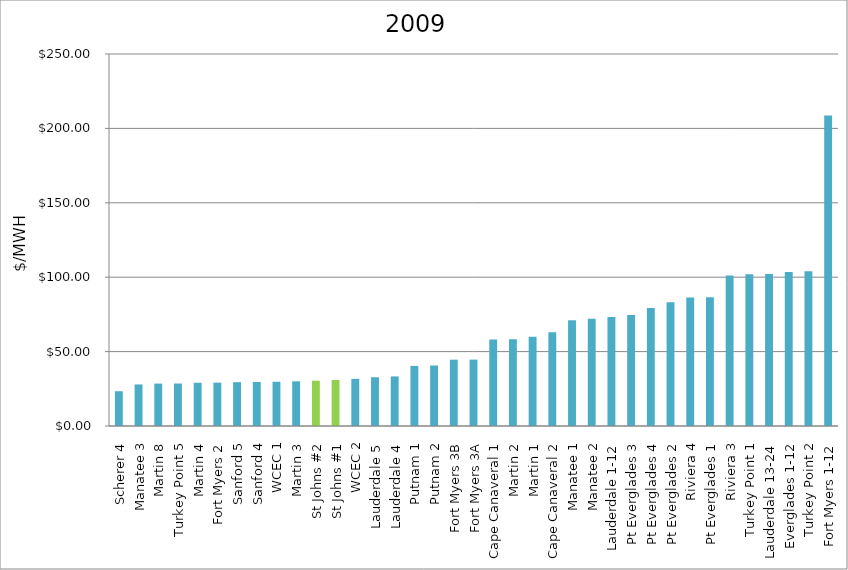
| Category | $/MWH |
|---|---|
| Scherer 4 | 23.378 |
| Manatee 3 | 27.932 |
| Martin 8 | 28.505 |
| Turkey Point 5 | 28.548 |
| Martin 4 | 29.068 |
| Fort Myers 2 | 29.156 |
| Sanford 5 | 29.474 |
| Sanford 4 | 29.608 |
| WCEC 1 | 29.735 |
| Martin 3 | 30.031 |
| St Johns #2 | 30.434 |
| St Johns #1 | 30.93 |
| WCEC 2 | 31.677 |
| Lauderdale 5 | 32.787 |
| Lauderdale 4 | 33.321 |
| Putnam 1 | 40.391 |
| Putnam 2 | 40.659 |
| Fort Myers 3B | 44.562 |
| Fort Myers 3A | 44.619 |
| Cape Canaveral 1 | 58.083 |
| Martin 2 | 58.296 |
| Martin 1 | 60.017 |
| Cape Canaveral 2 | 62.935 |
| Manatee 1 | 71.052 |
| Manatee 2 | 72.142 |
| Lauderdale 1-12 | 73.266 |
| Pt Everglades 3 | 74.587 |
| Pt Everglades 4 | 79.268 |
| Pt Everglades 2 | 83.233 |
| Riviera 4 | 86.311 |
| Pt Everglades 1 | 86.474 |
| Riviera 3 | 101.214 |
| Turkey Point 1 | 101.972 |
| Lauderdale 13-24 | 102.155 |
| Everglades 1-12 | 103.417 |
| Turkey Point 2 | 104.058 |
| Fort Myers 1-12 | 208.723 |